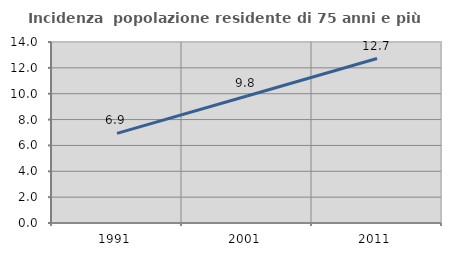
| Category | Incidenza  popolazione residente di 75 anni e più |
|---|---|
| 1991.0 | 6.929 |
| 2001.0 | 9.82 |
| 2011.0 | 12.723 |